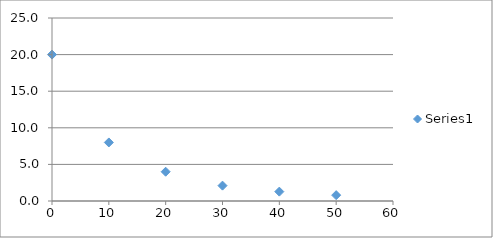
| Category | Series 0 |
|---|---|
| 0.0 | 20 |
| 10.0 | 8 |
| 20.0 | 4 |
| 30.0 | 2.1 |
| 40.0 | 1.28 |
| 50.0 | 0.8 |